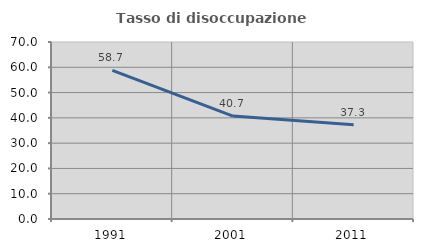
| Category | Tasso di disoccupazione giovanile  |
|---|---|
| 1991.0 | 58.744 |
| 2001.0 | 40.714 |
| 2011.0 | 37.321 |